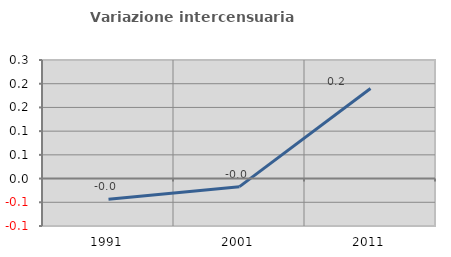
| Category | Variazione intercensuaria annua |
|---|---|
| 1991.0 | -0.043 |
| 2001.0 | -0.017 |
| 2011.0 | 0.19 |